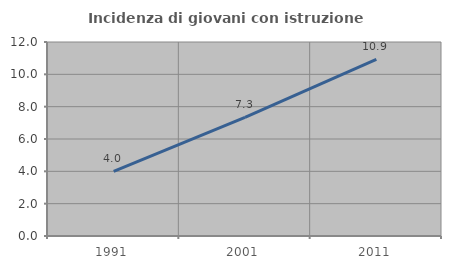
| Category | Incidenza di giovani con istruzione universitaria |
|---|---|
| 1991.0 | 4 |
| 2001.0 | 7.343 |
| 2011.0 | 10.922 |